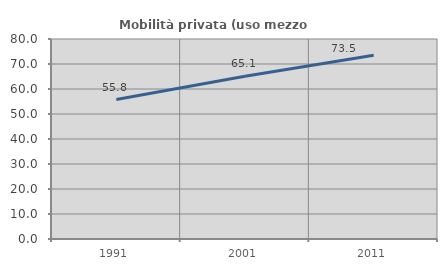
| Category | Mobilità privata (uso mezzo privato) |
|---|---|
| 1991.0 | 55.795 |
| 2001.0 | 65.106 |
| 2011.0 | 73.462 |